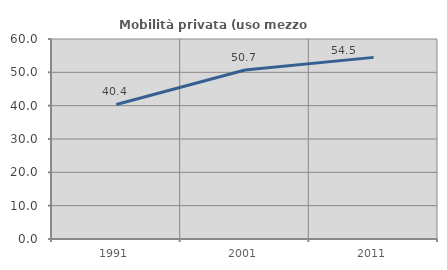
| Category | Mobilità privata (uso mezzo privato) |
|---|---|
| 1991.0 | 40.359 |
| 2001.0 | 50.694 |
| 2011.0 | 54.489 |